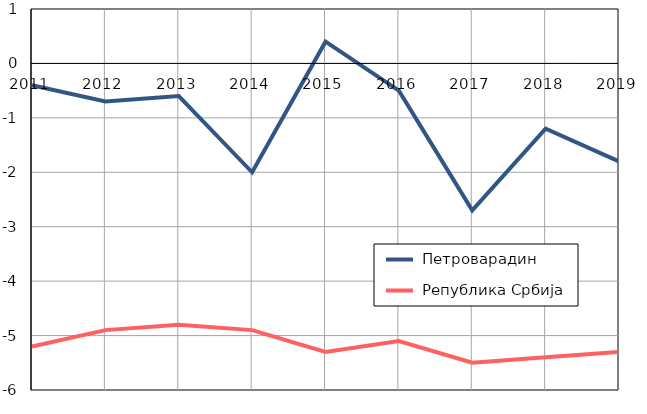
| Category |  Петроварадин |  Република Србија |
|---|---|---|
| 2011.0 | -0.4 | -5.2 |
| 2012.0 | -0.7 | -4.9 |
| 2013.0 | -0.6 | -4.8 |
| 2014.0 | -2 | -4.9 |
| 2015.0 | 0.4 | -5.3 |
| 2016.0 | -0.5 | -5.1 |
| 2017.0 | -2.7 | -5.5 |
| 2018.0 | -1.2 | -5.4 |
| 2019.0 | -1.8 | -5.3 |